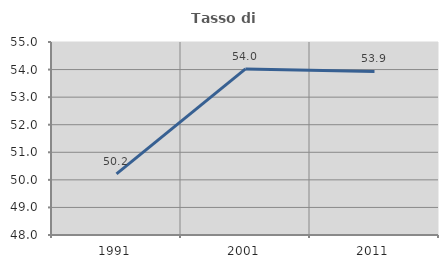
| Category | Tasso di occupazione   |
|---|---|
| 1991.0 | 50.22 |
| 2001.0 | 54.022 |
| 2011.0 | 53.933 |